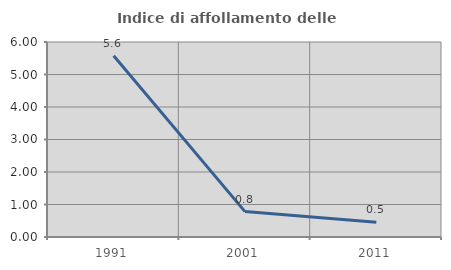
| Category | Indice di affollamento delle abitazioni  |
|---|---|
| 1991.0 | 5.575 |
| 2001.0 | 0.781 |
| 2011.0 | 0.452 |